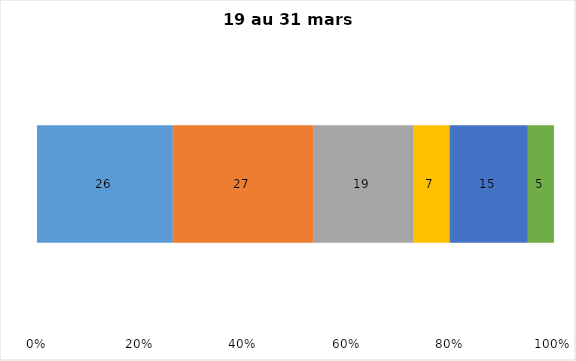
| Category | Plusieurs fois par jour | Une fois par jour | Quelques fois par semaine   | Une fois par semaine ou moins   |  Jamais   |  Je n’utilise pas les médias sociaux |
|---|---|---|---|---|---|---|
| 0 | 26 | 27 | 19 | 7 | 15 | 5 |